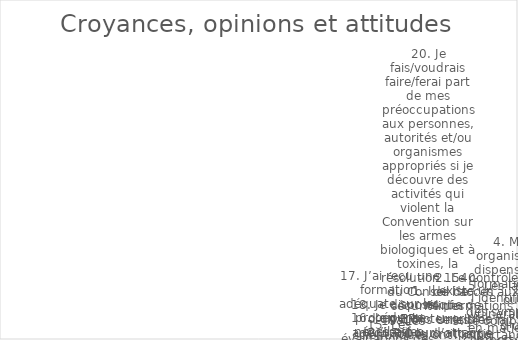
| Category | Series 0 |
|---|---|
| 1. Il existe un risque de bioterrorisme ou d’attaque avec une arme biologique. | 3 |
| 2. Le contrôle de l’accès aux informations sensibles fait partie intégrante de la biosûreté. | 1 |
| 3. Je comprends l’importance de la détermination de la fidélité. | 4 |
| 4. Mon organisation dispense une formation sur l’identification des symptômes d’un comportement à haut risque chez soi et chez les autres. | 5 |
| 5. Les lacunes ou vulnérabilités en matière de biosécurité et/ou de biosûreté sont corrigées avec un sentiment d’urgence. | 1 |
| 6. Je suis fier de mon travail. | 5 |
| 7. Mon organisation et ses membres encouragent le travail d’équipe et la coopération. | 3 |
| 8. Les infractions en matière de biosécurité et de biosûreté sont traitées de manière appropriée. | 3 |
| 9. Mon organisation se soucie plus de la biosécurité que des résultats de notre travail. | 1 |
| 10. Je suis conscient qu’il y a des problèmes et des conséquences éthiques, juridiques et sociétaux liés à mes recherches. | 0 |
| 11. L’expertise technique et l’expérience soutiennent l’assurance des performances futures en matière de biosécurité. | 1 |
| 12. Dans mon organisation, les individus ont les compétences appropriées pour effectuer les tâches qui leur sont assignées et pour travailler de manière sécuritaire et efficace. | 1 |
| 13. Mon organisation a une culture qui soutient et encourage la confiance, la collaboration, la consultation et la communication en matière de biosécurité et de biosûreté. | 3 |
| 14. La politique et la législation nationales relatives aux sciences de la vie visent à assurer une protection contre le mésusage de la science.6 | 2 |
| 15. Les évaluations des risques sont des outils importants pour identifier les domaines à améliorer et des mesures spécifiques pour réduire les risques, y compris le niveau de confinement requis. | 5 |
| 16. Je pense qu’il est important de signaler non seulement les accidents et incidents de laboratoire, mais aussi les quasi-accidents. | 3 |
| 17. J’ai reçu une formation adéquate sur les procédures nécessaires pour effectuer mon travail sans compromettre la sécurité et la sûreté. | 2 |
| 18. Je dispose d’un EPI adéquat pour effectuer mon travail en toute sécurité. | 5 |
| 19. Les scientifiques ont l’obligation de ne pas nuire . | 1 |
| 20. Je fais/voudrais faire/ferai part de mes préoccupations aux personnes, autorités et/ou organismes appropriés si je découvre des activités qui violent la Convention sur les armes biologiques et à toxines, la résolution 1540 du Conseil de sécurité des N | 3 |